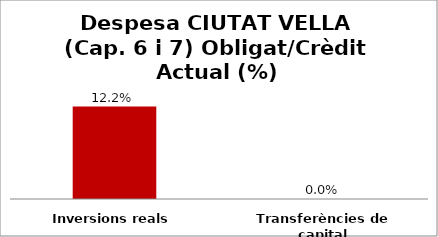
| Category | Series 0 |
|---|---|
| Inversions reals | 0.122 |
| Transferències de capital | 0 |